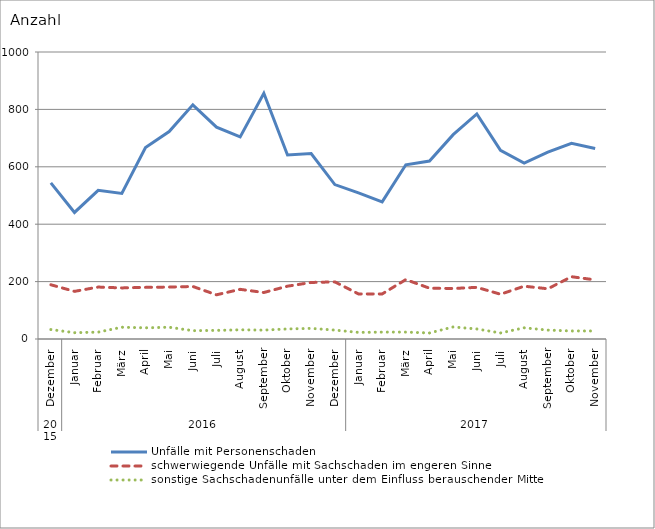
| Category | Unfälle mit Personenschaden | schwerwiegende Unfälle mit Sachschaden im engeren Sinne | sonstige Sachschadenunfälle unter dem Einfluss berauschender Mittel |
|---|---|---|---|
| 0 | 544 | 189 | 33 |
| 1 | 441 | 166 | 22 |
| 2 | 518 | 181 | 24 |
| 3 | 507 | 178 | 41 |
| 4 | 667 | 180 | 39 |
| 5 | 723 | 181 | 41 |
| 6 | 816 | 183 | 29 |
| 7 | 738 | 154 | 30 |
| 8 | 704 | 173 | 32 |
| 9 | 856 | 162 | 31 |
| 10 | 641 | 184 | 35 |
| 11 | 646 | 197 | 37 |
| 12 | 538 | 199 | 31 |
| 13 | 509 | 157 | 23 |
| 14 | 478 | 157 | 24 |
| 15 | 607 | 207 | 24 |
| 16 | 620 | 177 | 21 |
| 17 | 712 | 176 | 42 |
| 18 | 784 | 180 | 35 |
| 19 | 657 | 156 | 21 |
| 20 | 613 | 184 | 39 |
| 21 | 651 | 175 | 31 |
| 22 | 682 | 217 | 28 |
| 23 | 664 | 206 | 28 |